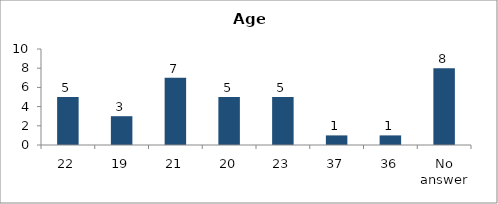
| Category | Age |
|---|---|
| 22 | 5 |
| 19 | 3 |
| 21 | 7 |
| 20 | 5 |
| 23 | 5 |
| 37 | 1 |
| 36 | 1 |
| No answer | 8 |